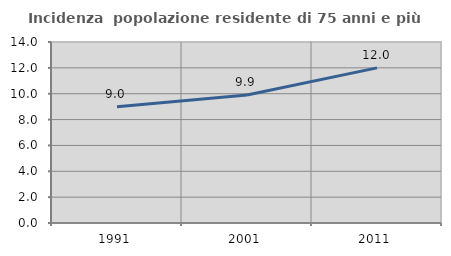
| Category | Incidenza  popolazione residente di 75 anni e più |
|---|---|
| 1991.0 | 8.991 |
| 2001.0 | 9.9 |
| 2011.0 | 12 |